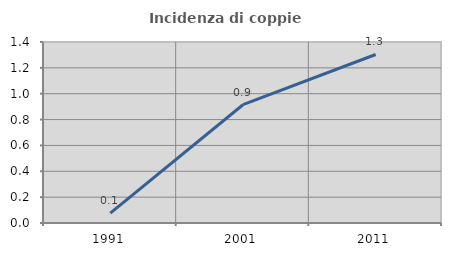
| Category | Incidenza di coppie miste |
|---|---|
| 1991.0 | 0.077 |
| 2001.0 | 0.915 |
| 2011.0 | 1.303 |